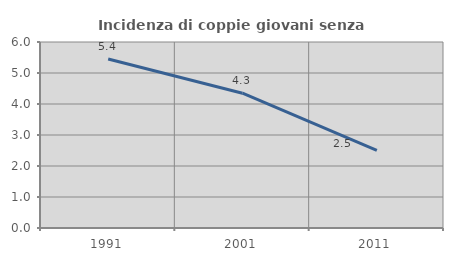
| Category | Incidenza di coppie giovani senza figli |
|---|---|
| 1991.0 | 5.45 |
| 2001.0 | 4.348 |
| 2011.0 | 2.506 |